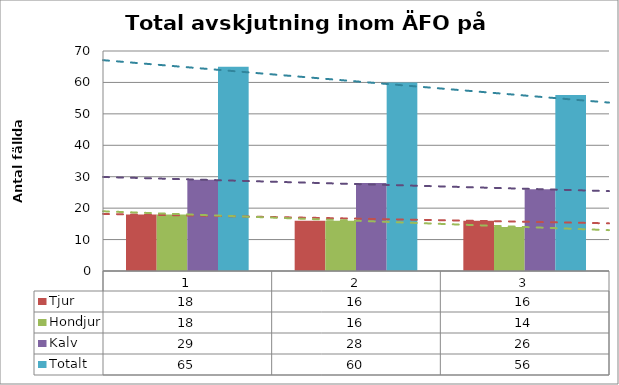
| Category | Tjur | Hondjur | Kalv | Totalt |
|---|---|---|---|---|
| 0 | 18 | 18 | 29 | 65 |
| 1 | 16 | 16 | 28 | 60 |
| 2 | 16 | 14 | 26 | 56 |